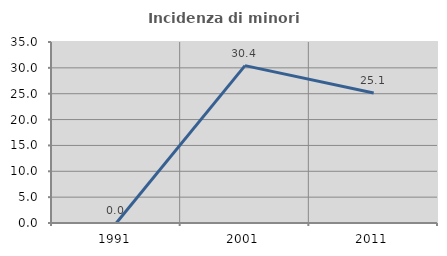
| Category | Incidenza di minori stranieri |
|---|---|
| 1991.0 | 0 |
| 2001.0 | 30.435 |
| 2011.0 | 25.126 |